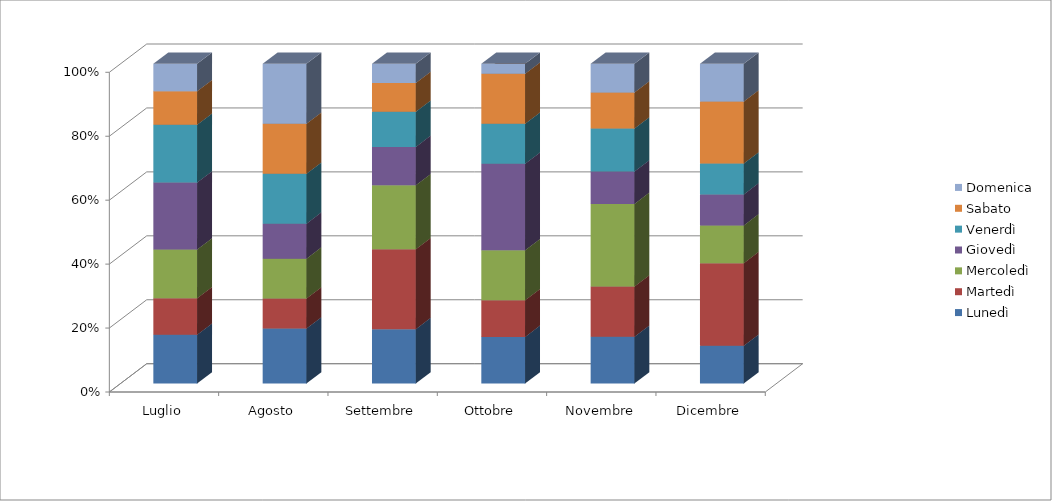
| Category | Lunedì | Martedì | Mercoledì | Giovedì | Venerdì | Sabato | Domenica |
|---|---|---|---|---|---|---|---|
| Luglio | 16 | 12 | 16 | 22 | 19 | 11 | 9 |
| Agosto | 11 | 6 | 8 | 7 | 10 | 10 | 12 |
| Settembre | 17 | 25 | 20 | 12 | 11 | 9 | 6 |
| Ottobre | 14 | 11 | 15 | 26 | 12 | 15 | 3 |
| Novembre | 13 | 14 | 23 | 9 | 12 | 10 | 8 |
| Dicembre | 11 | 24 | 11 | 9 | 9 | 18 | 11 |